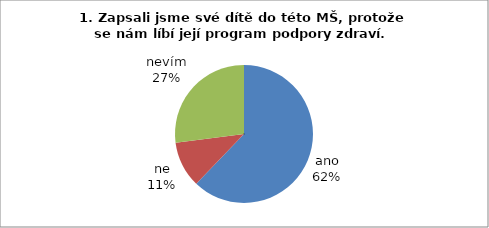
| Category | 1. Zapsali jsme své dítě do této MŠ, protože se nám líbí její program podpory zdraví. |
|---|---|
| ano | 23 |
| ne | 4 |
| nevím | 10 |